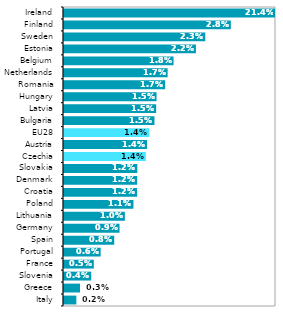
| Category | 2018* |
|---|---|
| Italy | 0.002 |
| Greece | 0.003 |
| Slovenia | 0.004 |
| France | 0.005 |
| Portugal | 0.006 |
| Spain | 0.008 |
| Germany | 0.009 |
| Lithuania | 0.01 |
| Poland | 0.011 |
| Croatia | 0.012 |
| Denmark | 0.012 |
| Slovakia | 0.012 |
| Czechia | 0.014 |
| Austria | 0.014 |
| EU28 | 0.014 |
| Bulgaria | 0.015 |
| Latvia | 0.015 |
| Hungary | 0.015 |
| Romania | 0.017 |
| Netherlands | 0.017 |
| Belgium | 0.018 |
| Estonia | 0.022 |
| Sweden | 0.023 |
| Finland | 0.028 |
| Ireland | 0.214 |